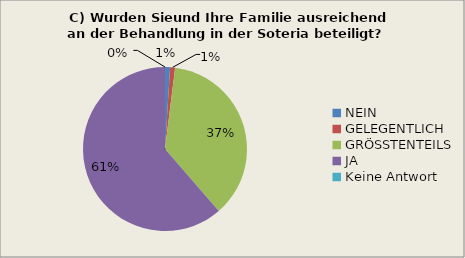
| Category | 5C | 6C |
|---|---|---|
| NEIN | 1 | 10 |
| GELEGENTLICH | 1 | 7 |
| GRÖSSTENTEILS | 37 | 60 |
| JA | 62 | 24 |
| Keine Antwort | 0 | 0 |